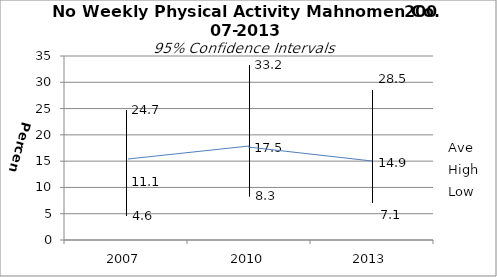
| Category | Ave | High | Low |
|---|---|---|---|
| 2007.0 | 11.1 | 24.7 | 4.6 |
| 2010.0 | 17.5 | 33.2 | 8.3 |
| 2013.0 | 14.9 | 28.5 | 7.1 |